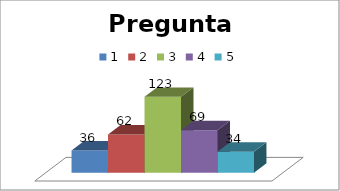
| Category | 1 | 2 | 3 | 4 | 5 |
|---|---|---|---|---|---|
| 0 | 36 | 62 | 123 | 69 | 34 |